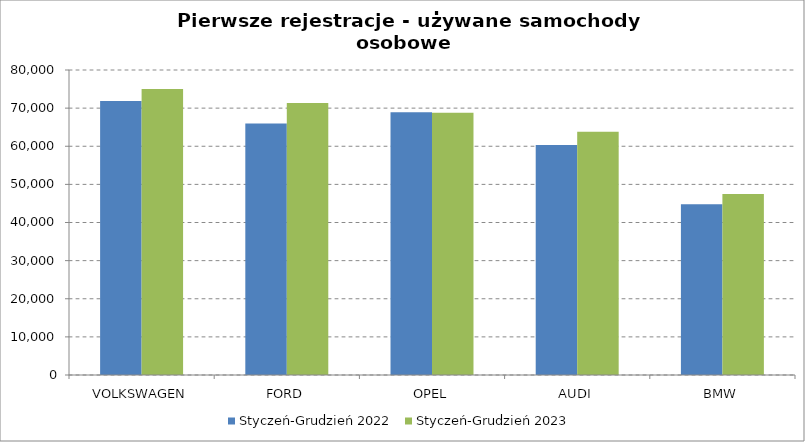
| Category | Styczeń-Grudzień 2022 | Styczeń-Grudzień 2023 |
|---|---|---|
| VOLKSWAGEN | 71863 | 74994 |
| FORD | 65961 | 71347 |
| OPEL | 68912 | 68818 |
| AUDI | 60314 | 63796 |
| BMW | 44789 | 47456 |